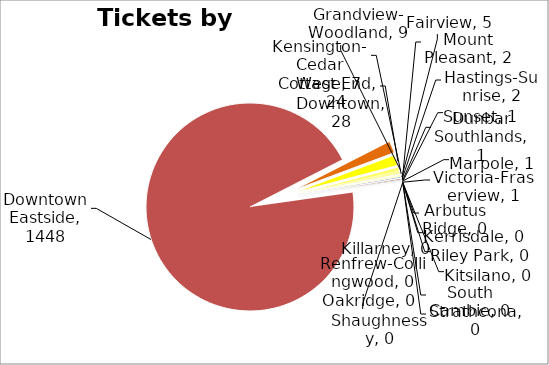
| Category | Tickets |
|---|---|
| Downtown Eastside | 1448 |
| Downtown | 28 |
| West End | 24 |
| Grandview-Woodland | 9 |
| Kensington-Cedar Cottage | 7 |
| Fairview | 5 |
| Hastings-Sunrise | 2 |
| Mount Pleasant | 2 |
| Dunbar Southlands | 1 |
| Marpole | 1 |
| Sunset | 1 |
| Victoria-Fraserview | 1 |
| Arbutus Ridge | 0 |
| Kerrisdale | 0 |
| Killarney | 0 |
| Kitsilano | 0 |
| Oakridge | 0 |
| Renfrew-Collingwood | 0 |
| Riley Park | 0 |
| Shaughnessy | 0 |
| South Cambie | 0 |
| Strathcona | 0 |
| West Point Grey | 0 |